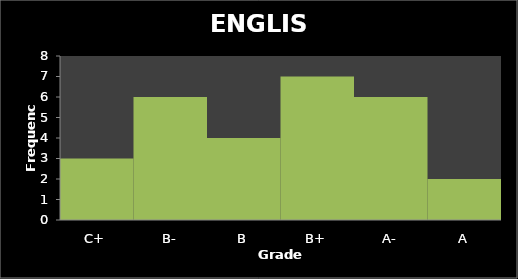
| Category | Series 0 |
|---|---|
| C+ | 3 |
| B- | 6 |
| B | 4 |
| B+ | 7 |
| A- | 6 |
| A | 2 |